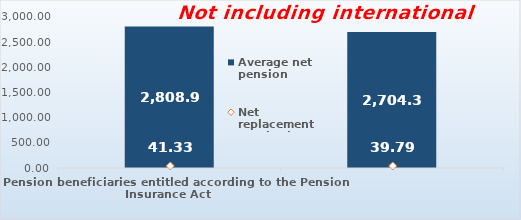
| Category | Average net pension  |
|---|---|
| Pension beneficiaries entitled according to the Pension Insurance Act   | 2808.93 |
| Pension beneficiaries entitled to pension FOR THE FIRST TIME in 2020 according to the Pension Insurance Act  - NEW BENEFICIARIES | 2704.34 |